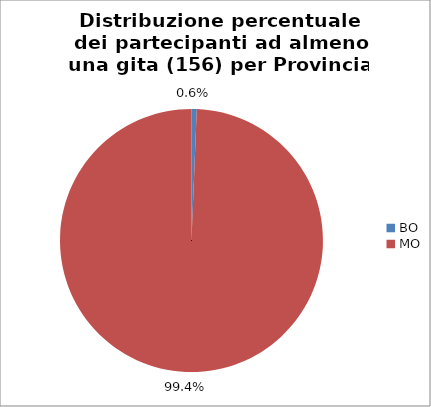
| Category | Nr. Tesserati |
|---|---|
| BO | 1 |
| MO | 155 |